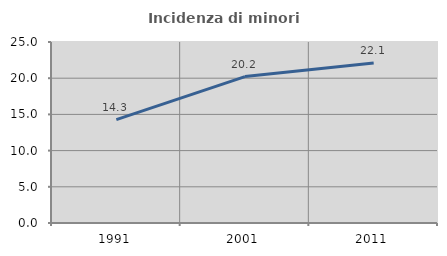
| Category | Incidenza di minori stranieri |
|---|---|
| 1991.0 | 14.286 |
| 2001.0 | 20.225 |
| 2011.0 | 22.112 |